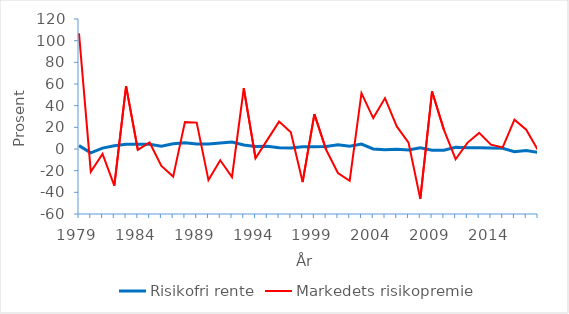
| Category | Risikofri rente | Markedets risikopremie |
|---|---|---|
| 1979.0 | 3.121 | 106.805 |
| 1980.0 | -3.505 | -20.94 |
| 1981.0 | 0.811 | -4.597 |
| 1982.0 | 2.979 | -33.725 |
| 1983.0 | 4.33 | 57.981 |
| 1984.0 | 4.441 | -0.892 |
| 1985.0 | 4.358 | 6.054 |
| 1986.0 | 2.509 | -15.675 |
| 1987.0 | 4.746 | -25.474 |
| 1988.0 | 5.691 | 24.853 |
| 1989.0 | 4.619 | 24.362 |
| 1990.0 | 4.627 | -28.726 |
| 1991.0 | 5.436 | -10.404 |
| 1992.0 | 6.42 | -25.828 |
| 1993.0 | 3.727 | 56.075 |
| 1994.0 | 2.255 | -8.555 |
| 1995.0 | 2.48 | 8.446 |
| 1996.0 | 1.185 | 25.304 |
| 1997.0 | 0.97 | 15.351 |
| 1998.0 | 2.154 | -30.531 |
| 1999.0 | 2.113 | 32.239 |
| 2000.0 | 2.242 | -0.751 |
| 2001.0 | 3.973 | -22.159 |
| 2002.0 | 2.517 | -29.275 |
| 2003.0 | 4.604 | 51.546 |
| 2004.0 | 0.084 | 28.5 |
| 2005.0 | -0.664 | 46.973 |
| 2006.0 | -0.295 | 20.82 |
| 2007.0 | -0.816 | 5.867 |
| 2008.0 | 1.148 | -46.1 |
| 2009.0 | -1.079 | 53.142 |
| 2010.0 | -1.109 | 17.878 |
| 2011.0 | 1.539 | -9.429 |
| 2012.0 | 1.114 | 5.667 |
| 2013.0 | 1.093 | 14.864 |
| 2014.0 | 0.907 | 3.977 |
| 2015.0 | 0.598 | 1.486 |
| 2016.0 | -2.529 | 27.108 |
| 2017.0 | -1.446 | 17.814 |
| 2018.0 | -3.236 | -1.251 |